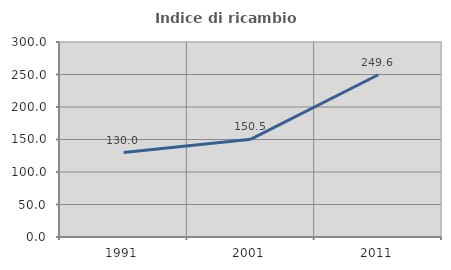
| Category | Indice di ricambio occupazionale  |
|---|---|
| 1991.0 | 130 |
| 2001.0 | 150.468 |
| 2011.0 | 249.6 |